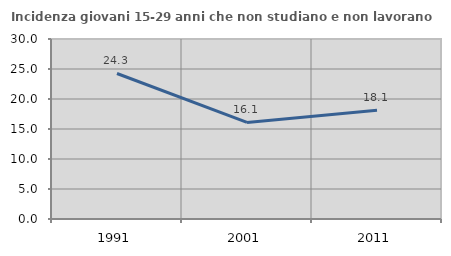
| Category | Incidenza giovani 15-29 anni che non studiano e non lavorano  |
|---|---|
| 1991.0 | 24.253 |
| 2001.0 | 16.093 |
| 2011.0 | 18.113 |